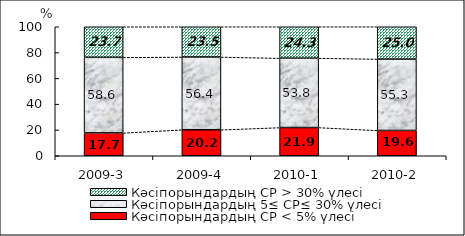
| Category | Кәсіпорындардың СР < 5% үлесі | Кәсіпорындардың 5≤ СР≤ 30% үлесі | Кәсіпорындардың СР > 30% үлесі |
|---|---|---|---|
| 2009-3 | 17.709 | 58.579 | 23.712 |
| 2009-4 | 20.166 | 56.376 | 23.457 |
| 2010-1 | 21.869 | 53.785 | 24.346 |
| 2010-2 | 19.63 | 55.325 | 25.045 |